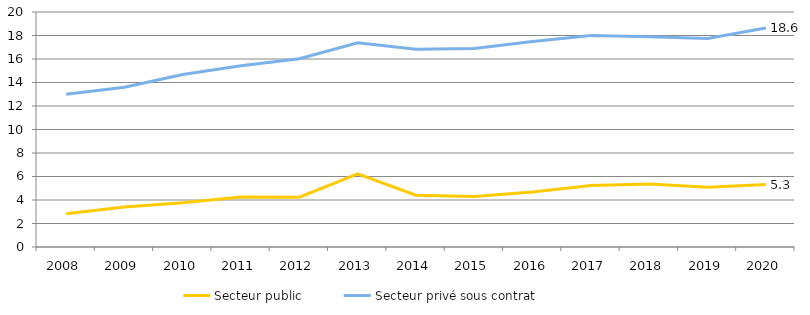
| Category | Secteur public | Secteur privé sous contrat |
|---|---|---|
| 2008.0 | 2.831 | 12.998 |
| 2009.0 | 3.407 | 13.594 |
| 2010.0 | 3.764 | 14.674 |
| 2011.0 | 4.25 | 15.419 |
| 2012.0 | 4.241 | 16.022 |
| 2013.0 | 6.232 | 17.373 |
| 2014.0 | 4.406 | 16.832 |
| 2015.0 | 4.3 | 16.897 |
| 2016.0 | 4.681 | 17.498 |
| 2017.0 | 5.24 | 18.002 |
| 2018.0 | 5.358 | 17.903 |
| 2019.0 | 5.092 | 17.752 |
| 2020.0 | 5.315 | 18.64 |